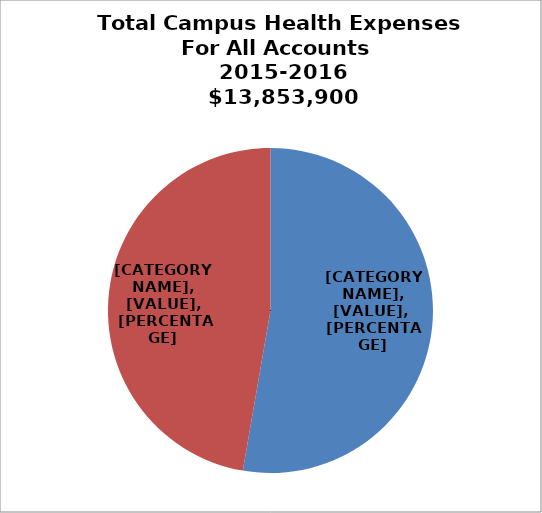
| Category | Series 0 |
|---|---|
| Local/Non-Hlth & Rec | 7304600 |
| Health & Rec | 6549300 |